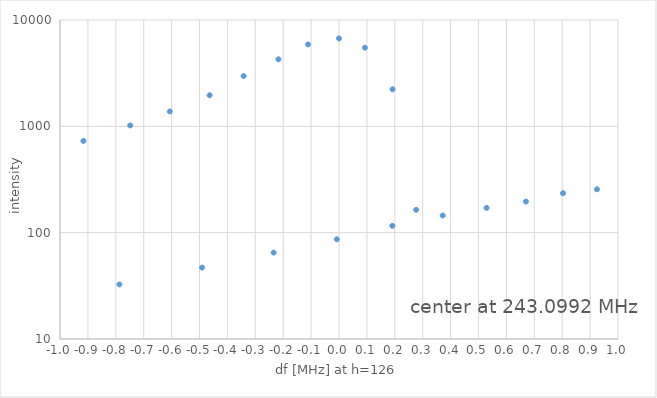
| Category | Intensity |
|---|---|
| -6.850331244440067 | 1.74 |
| -6.2703431771711715 | 3.31 |
| -6.04513413218296 | 1.02 |
| -5.749426158418953 | 6.06 |
| -5.295939353507903 | 2.35 |
| -5.281219028651973 | 11.4 |
| -4.853838307877138 | 8.63 |
| -4.687191916017734 | 8.18 |
| -4.467926205451222 | 14.2 |
| -4.2552435387490135 | 1.43 |
| -4.133165624832177 | 15.5 |
| -4.114327622196347 | 22.5 |
| -3.7910050341761514 | 35.3 |
| -3.671627467692411 | 20.3 |
| -3.4948386710143846 | 49 |
| -3.3626476603483577 | 2.73 |
| -3.242298971353421 | 37.5 |
| -3.2239037380743856 | 70.8 |
| -2.973265837336404 | 100 |
| -2.882852624365051 | 59.3 |
| -2.742923995742031 | 85.2 |
| -2.631425960007431 | 4.84 |
| -2.539828637718464 | 86.4 |
| -2.5299007454345466 | 139 |
| -2.3306873737467315 | 225 |
| -2.249197770079599 | 120 |
| -2.145331345451358 | 226 |
| -2.04097848126666 | 8.56 |
| -1.9707522178833998 | 240 |
| -1.9645010847376023 | 179 |
| -1.807606920845301 | 304 |
| -1.7228193170025892 | 244 |
| -1.6532038847217854 | 422 |
| -1.5532427451107211 | 13.7 |
| -1.5073397416614898 | 502 |
| -1.4869037901489746 | 328 |
| -1.3699799903166925 | 97.4 |
| -1.2857916071626905 | 0 |
| -1.2847287262755285 | 433 |
| -1.1413806645005806 | 21 |
| -1.0856226830048332 | 576 |
| -0.9158688362948271 | 729 |
| -0.7870073808627751 | 32.6 |
| -0.7482512939592997 | 1020 |
| -0.6063390761160032 | 1380 |
| -0.49079302967666405 | 46.9 |
| -0.46384891348614316 | 1960 |
| -0.34173885048882285 | 2970 |
| -0.23431963321831606 | 64.9 |
| -0.21699991052594625 | 4270 |
| -0.11092750731439843 | 5890 |
| -0.007770454470581233 | 86.6 |
| -0.0013417759502610525 | 0 |
| 0.0 | 6710 |
| 0.0929231718738639 | 5490 |
| 0.1911561824298758 | 116 |
| 0.19200661937815128 | 2230 |
| 0.27653745315810313 | 164 |
| 0.37177238172752286 | 145 |
| 0.5289396689073514 | 171 |
| 0.6699367859112655 | 196 |
| 0.8030019404813933 | 235 |
| 0.9247403654327582 | 256 |
| 1.0370026032705206 | 268 |
| 1.139029037017598 | 277 |
| 1.2325428767216577 | 330 |
| 1.31988794461282 | 314 |
| 1.39854193979124 | 298 |
| 1.4677709053339554 | 274 |
| 1.5317018984394353 | 248 |
| 1.5918824823653008 | 200 |
| 1.6475722689668988 | 124 |
| 1.7005614971753535 | 52.7 |
| 1.749288968346502 | 13 |
| 1.7971998931830089 | 1.35 |
| 3.20615300148639 | 3 |
| 3.329226376072474 | 4.48 |
| 3.3483906780431973 | 8.86 |
| 3.3543349084286085 | 3.33 |
| 3.3832697376389116 | 15.5 |
| 3.390685306957768 | 6.6 |
| 3.3975632468763464 | 12.3 |
| 3.4119917550275587 | 23.8 |
| 3.4255925934809004 | 20 |
| 3.43697749203072 | 31.4 |
| 3.442556638924807 | 34.3 |
| 3.4473527258011276 | 32.2 |
| 3.44820298612543 | 25.1 |
| 3.4485248390516485 | 27.2 |
| 3.453251664217634 | 18.2 |
| 3.454091700718799 | 33.4 |
| 3.4573794664334914 | 34.7 |
| 3.4589678166132196 | 8.91 |
| 3.4590601217374233 | 21.1 |
| 3.461234870325118 | 28.6 |
| 3.4634508484751882 | 3.29 |
| 3.4638088371780977 | 13.8 |
| 3.468396000223453 | 5.53 |
| 3.4724588621596593 | 1.73 |
| 6.667401655328615 | 1.08 |
| 6.858656219464507 | 1.37 |
| 7.073665481483884 | 1.69 |
| 7.3079059824638986 | 1.88 |
| 7.580838924310129 | 2.02 |
| 7.896517213427029 | 2.06 |
| 8.26628951324821 | 1.89 |
| 8.700652946266269 | 1.73 |
| 9.244386104569346 | 1.4 |
| 9.904289541483518 | 1.06 |